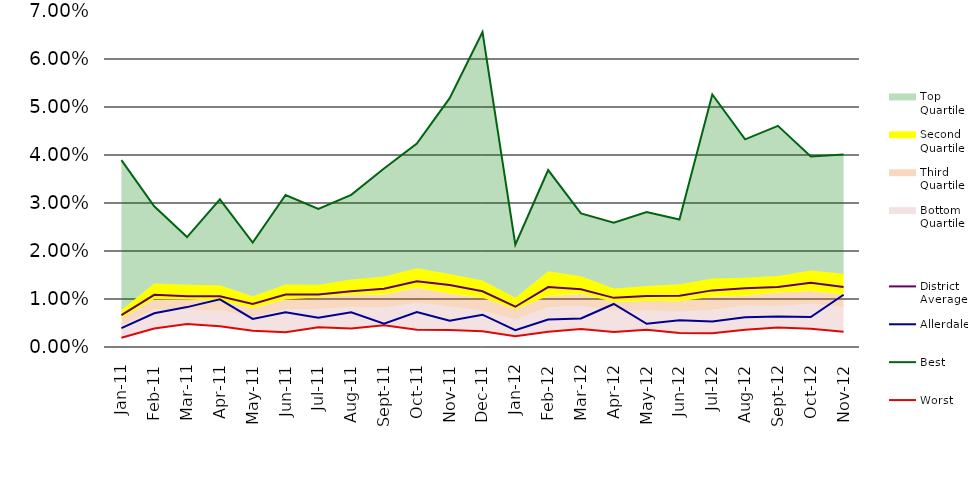
| Category | Worst | Best | Allerdale | District Average |
|---|---|---|---|---|
| 0 | 0.002 | 0.039 | 0.004 | 0.007 |
| 1 | 0.004 | 0.029 | 0.007 | 0.011 |
| 2 | 0.005 | 0.023 | 0.008 | 0.011 |
| 3 | 0.004 | 0.031 | 0.01 | 0.011 |
| 4 | 0.003 | 0.022 | 0.006 | 0.009 |
| 5 | 0.003 | 0.032 | 0.007 | 0.011 |
| 6 | 0.004 | 0.029 | 0.006 | 0.011 |
| 7 | 0.004 | 0.032 | 0.007 | 0.012 |
| 8 | 0.005 | 0.037 | 0.005 | 0.012 |
| 9 | 0.004 | 0.042 | 0.007 | 0.014 |
| 10 | 0.004 | 0.052 | 0.005 | 0.013 |
| 11 | 0.003 | 0.066 | 0.007 | 0.012 |
| 12 | 0.002 | 0.021 | 0.003 | 0.008 |
| 13 | 0.003 | 0.037 | 0.006 | 0.012 |
| 14 | 0.004 | 0.028 | 0.006 | 0.012 |
| 15 | 0.003 | 0.026 | 0.009 | 0.01 |
| 16 | 0.004 | 0.028 | 0.005 | 0.011 |
| 17 | 0.003 | 0.027 | 0.006 | 0.011 |
| 18 | 0.003 | 0.053 | 0.005 | 0.012 |
| 19 | 0.004 | 0.043 | 0.006 | 0.012 |
| 20 | 0.004 | 0.046 | 0.006 | 0.013 |
| 21 | 0.004 | 0.04 | 0.006 | 0.013 |
| 22 | 0.003 | 0.04 | 0.011 | 0.012 |